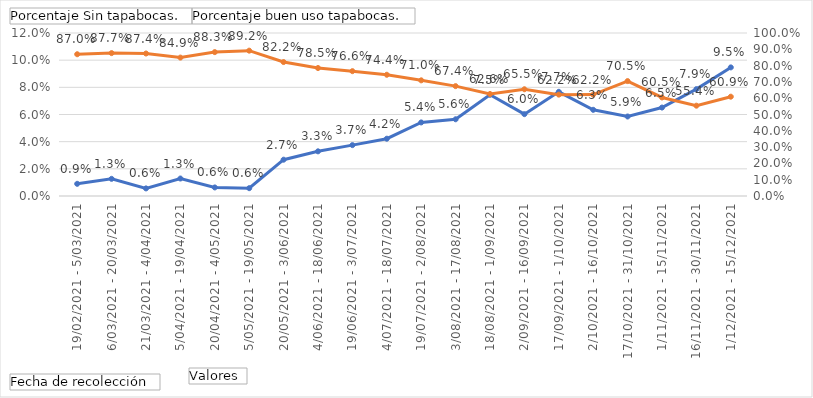
| Category | Porcentaje Sin tapabocas. |
|---|---|
| 19/02/2021 - 5/03/2021 | 0.009 |
| 6/03/2021 - 20/03/2021 | 0.013 |
| 21/03/2021 - 4/04/2021 | 0.006 |
| 5/04/2021 - 19/04/2021 | 0.013 |
| 20/04/2021 - 4/05/2021 | 0.006 |
| 5/05/2021 - 19/05/2021 | 0.006 |
| 20/05/2021 - 3/06/2021 | 0.027 |
| 4/06/2021 - 18/06/2021 | 0.033 |
| 19/06/2021 - 3/07/2021 | 0.037 |
| 4/07/2021 - 18/07/2021 | 0.042 |
| 19/07/2021 - 2/08/2021 | 0.054 |
| 3/08/2021 - 17/08/2021 | 0.056 |
| 18/08/2021 - 1/09/2021 | 0.075 |
| 2/09/2021 - 16/09/2021 | 0.06 |
| 17/09/2021 - 1/10/2021 | 0.077 |
| 2/10/2021 - 16/10/2021 | 0.063 |
| 17/10/2021 - 31/10/2021 | 0.059 |
| 1/11/2021 - 15/11/2021 | 0.065 |
| 16/11/2021 - 30/11/2021 | 0.079 |
| 1/12/2021 - 15/12/2021 | 0.095 |